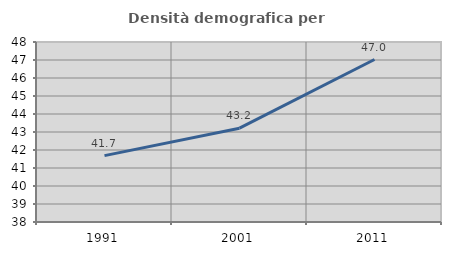
| Category | Densità demografica |
|---|---|
| 1991.0 | 41.688 |
| 2001.0 | 43.213 |
| 2011.0 | 47.026 |